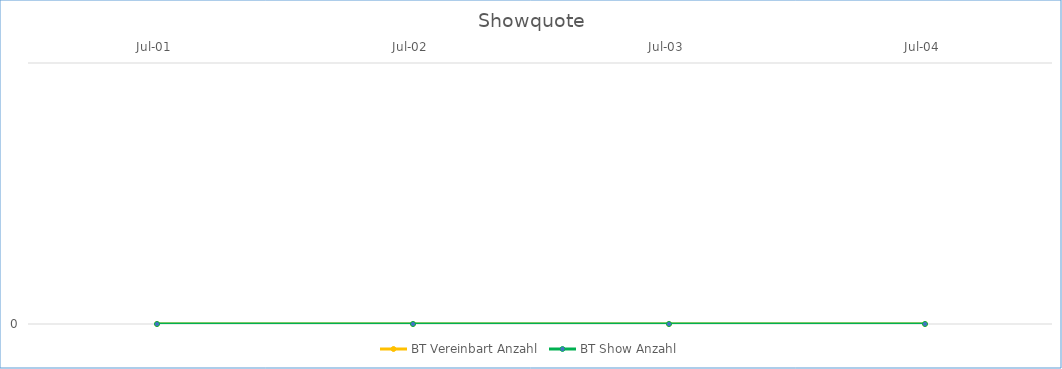
| Category | BT Vereinbart Anzahl | BT Show Anzahl |
|---|---|---|
| 2001-07-01 | 0 | 0 |
| 2002-07-01 | 0 | 0 |
| 2003-07-01 | 0 | 0 |
| 2004-07-01 | 0 | 0 |